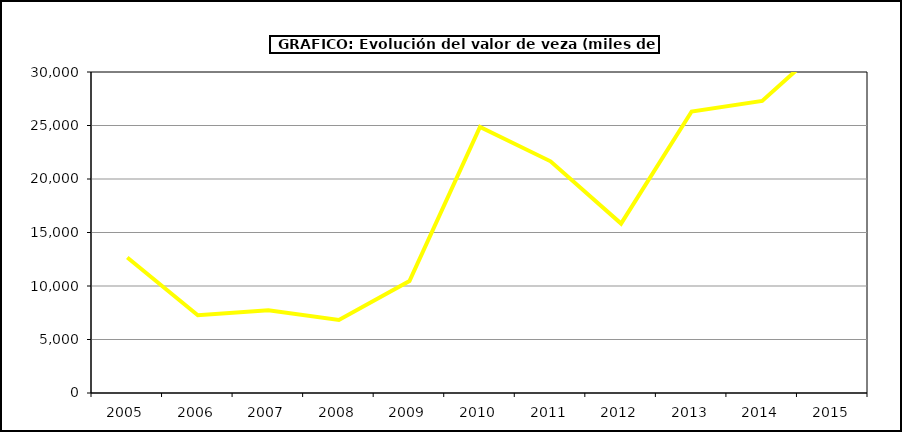
| Category | Valor |
|---|---|
| 2005.0 | 12656.801 |
| 2006.0 | 7266.675 |
| 2007.0 | 7737.806 |
| 2008.0 | 6819.132 |
| 2009.0 | 10457.841 |
| 2010.0 | 24873.072 |
| 2011.0 | 21651.853 |
| 2012.0 | 15834 |
| 2013.0 | 26306.52 |
| 2014.0 | 27301.452 |
| 2015.0 | 33211 |